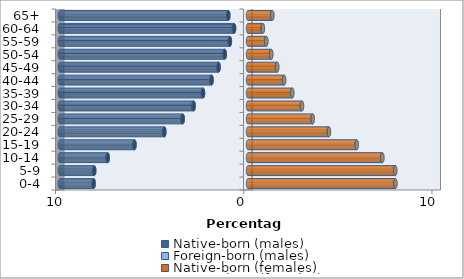
| Category | Native-born (males) | Foreign-born (males) | Native-born (females) | Foreign-born (females) |
|---|---|---|---|---|
| 0-4 | -8.198 | -0.011 | 7.821 | 0.009 |
| 5-9 | -8.169 | -0.012 | 7.814 | 0.009 |
| 10-14 | -7.452 | -0.013 | 7.128 | 0.012 |
| 15-19 | -6.029 | -0.015 | 5.765 | 0.014 |
| 20-24 | -4.442 | -0.017 | 4.287 | 0.015 |
| 25-29 | -3.466 | -0.019 | 3.422 | 0.016 |
| 30-34 | -2.886 | -0.02 | 2.857 | 0.015 |
| 35-39 | -2.388 | -0.019 | 2.34 | 0.014 |
| 40-44 | -1.935 | -0.017 | 1.91 | 0.012 |
| 45-49 | -1.563 | -0.015 | 1.543 | 0.01 |
| 50-54 | -1.235 | -0.012 | 1.227 | 0.008 |
| 55-59 | -0.962 | -0.01 | 0.967 | 0.007 |
| 60-64 | -0.739 | -0.009 | 0.782 | 0.005 |
| 65+ | -1.046 | -0.005 | 1.286 | 0.004 |